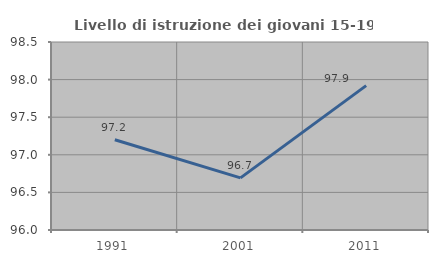
| Category | Livello di istruzione dei giovani 15-19 anni |
|---|---|
| 1991.0 | 97.2 |
| 2001.0 | 96.693 |
| 2011.0 | 97.92 |